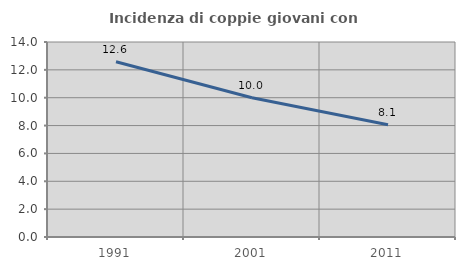
| Category | Incidenza di coppie giovani con figli |
|---|---|
| 1991.0 | 12.585 |
| 2001.0 | 9.995 |
| 2011.0 | 8.054 |